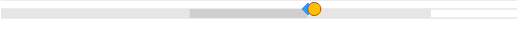
| Category | left | mid start | mid end | right |
|---|---|---|---|---|
| 0 | 0 | 0.438 | 0.275 | 0.287 |